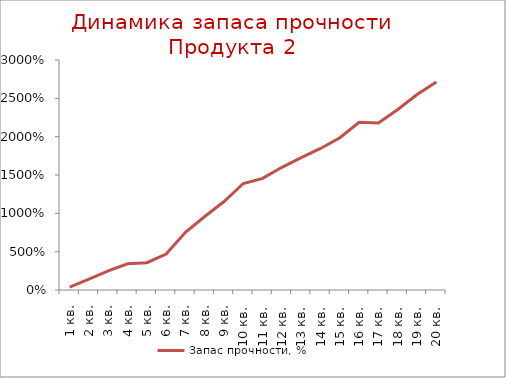
| Category | Запас прочности, % |
|---|---|
| 1 кв. | 0.388 |
| 2 кв. | 1.418 |
| 3 кв. | 2.487 |
| 4 кв. | 3.424 |
| 5 кв. | 3.558 |
| 6 кв. | 4.688 |
| 7 кв. | 7.534 |
| 8 кв. | 9.586 |
| 9 кв. | 11.541 |
| 10 кв. | 13.89 |
| 11 кв. | 14.556 |
| 12 кв. | 16.004 |
| 13 кв. | 17.272 |
| 14 кв. | 18.459 |
| 15 кв. | 19.859 |
| 16 кв. | 21.883 |
| 17 кв. | 21.799 |
| 18 кв. | 23.551 |
| 19 кв. | 25.493 |
| 20 кв. | 27.124 |